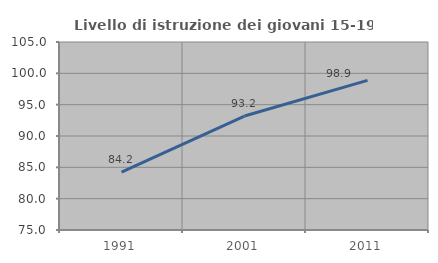
| Category | Livello di istruzione dei giovani 15-19 anni |
|---|---|
| 1991.0 | 84.245 |
| 2001.0 | 93.188 |
| 2011.0 | 98.883 |